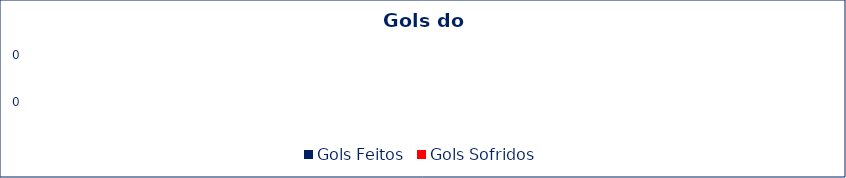
| Category | Gols Feitos | Gols Sofridos |
|---|---|---|
| Gols Feitos | 0 | 0 |
| Gols Sofridos | 0 | 0 |